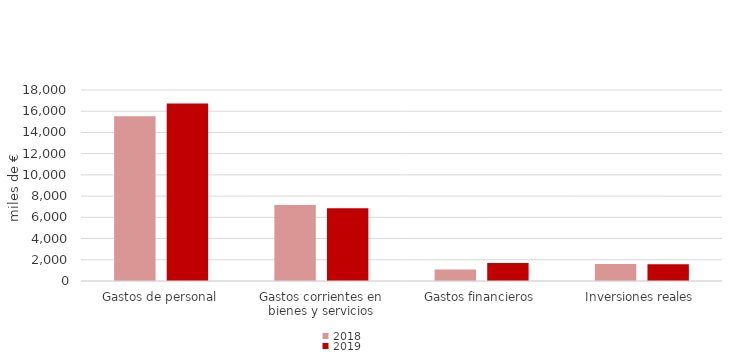
| Category | 2018 | 2019 |
|---|---|---|
| Gastos de personal | 15527.24 | 16718.03 |
| Gastos corrientes en bienes y servicios | 7173.79 | 6859.08 |
| Gastos financieros | 1082.38 | 1686.22 |
| Inversiones reales | 1596.02 | 1568.63 |